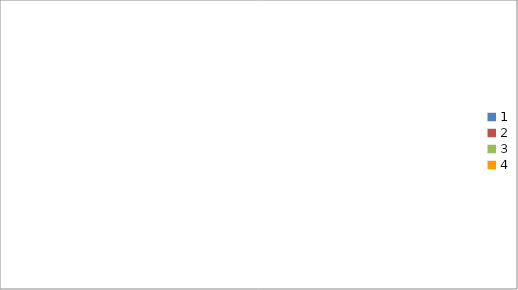
| Category | Series 0 |
|---|---|
| 0 | 2500 |
| 1 | 990 |
| 2 | 1650 |
| 3 | 630 |